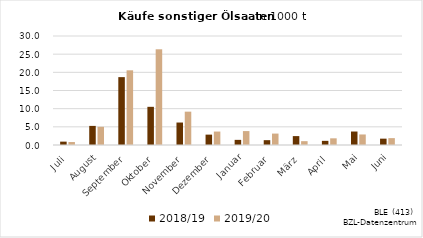
| Category | 2018/19 | 2019/20 |
|---|---|---|
| Juli | 0.926 | 0.815 |
| August | 5.257 | 5.008 |
| September | 18.679 | 20.556 |
| Oktober | 10.508 | 26.344 |
| November | 6.185 | 9.178 |
| Dezember | 2.854 | 3.7 |
| Januar | 1.413 | 3.831 |
| Februar | 1.33 | 3.142 |
| März | 2.45 | 1.055 |
| April | 1.141 | 1.838 |
| Mai | 3.709 | 2.9 |
| Juni | 1.746 | 1.89 |